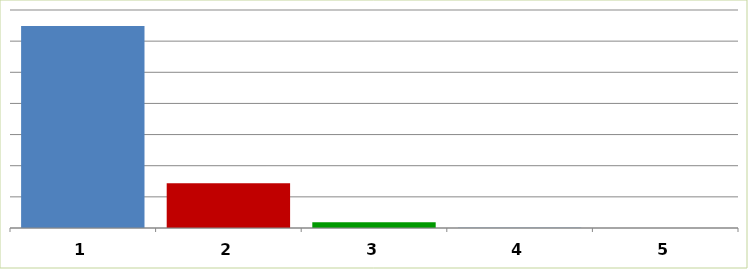
| Category | Series 0 |
|---|---|
| 0 | 64863007 |
| 1 | 14348473 |
| 2 | 1881234.2 |
| 3 | 108000 |
| 4 | 0 |